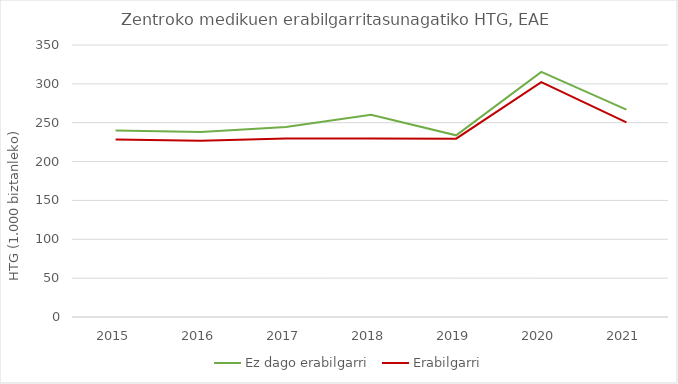
| Category | Ez dago erabilgarri | Erabilgarri |
|---|---|---|
| 2015.0 | 239.857 | 228.474 |
| 2016.0 | 237.995 | 226.748 |
| 2017.0 | 244.551 | 229.703 |
| 2018.0 | 260.37 | 229.794 |
| 2019.0 | 233.78 | 229.436 |
| 2020.0 | 315.358 | 302.254 |
| 2021.0 | 266.782 | 250.427 |